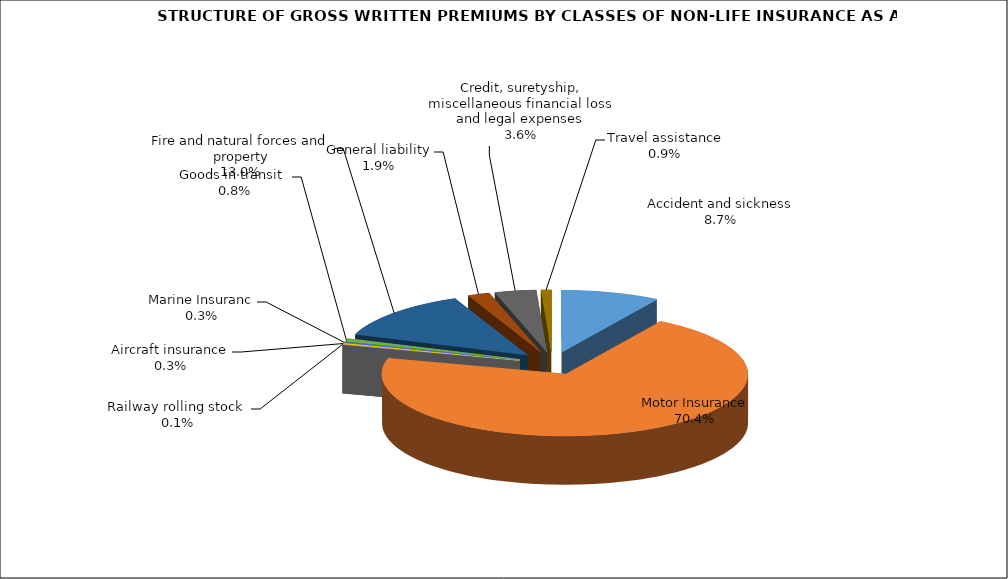
| Category | Accident and sickness | Series 1 |
|---|---|---|
| Accident and sickness | 0.087 |  |
| Motor Insurance | 0.704 |  |
| Railway rolling stock  | 0.001 |  |
| Aircraft insurance | 0.003 |  |
| Marine Insuranc | 0.003 |  |
| Goods in transit  | 0.008 |  |
| Fire and natural forces and property | 0.13 |  |
| General liability | 0.019 |  |
| Credit, suretyship, miscellaneous financial loss and legal expenses | 0.036 |  |
| Travel assistance | 0.009 |  |